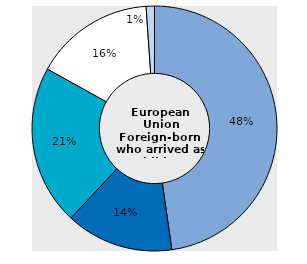
| Category | Series 1 |
|---|---|
| Europe | 47.737 |
| Africa | 14.226 |
| Asia | 21.107 |
| Latin America | 15.833 |
| North America and Oceania | 1.096 |